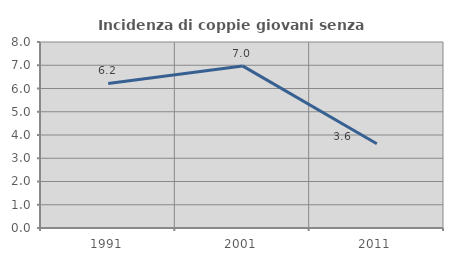
| Category | Incidenza di coppie giovani senza figli |
|---|---|
| 1991.0 | 6.218 |
| 2001.0 | 6.971 |
| 2011.0 | 3.625 |